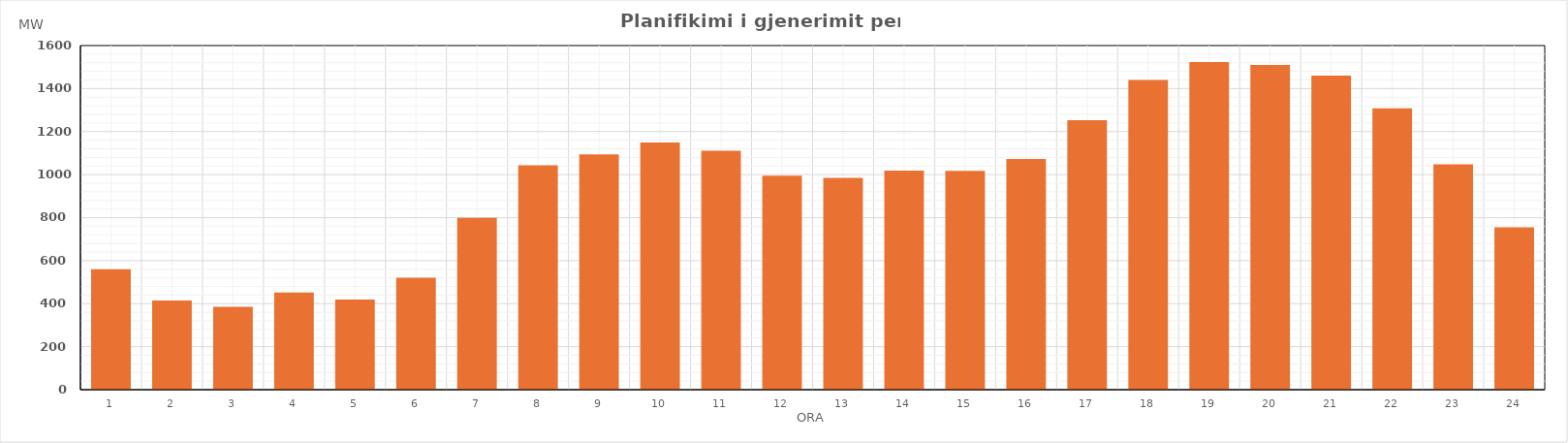
| Category | Max (MW) |
|---|---|
| 0 | 559.86 |
| 1 | 414.87 |
| 2 | 385.86 |
| 3 | 451.86 |
| 4 | 418.84 |
| 5 | 520.85 |
| 6 | 798.94 |
| 7 | 1043.78 |
| 8 | 1093.65 |
| 9 | 1149.41 |
| 10 | 1111.35 |
| 11 | 994.89 |
| 12 | 984.4 |
| 13 | 1018.39 |
| 14 | 1017.58 |
| 15 | 1073.07 |
| 16 | 1252.54 |
| 17 | 1440.12 |
| 18 | 1523.6 |
| 19 | 1510.32 |
| 20 | 1459.82 |
| 21 | 1307.65 |
| 22 | 1047.71 |
| 23 | 754.49 |